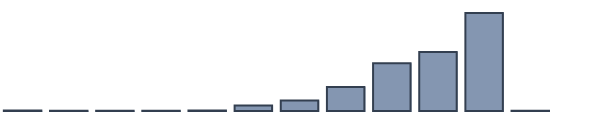
| Category | Series 0 |
|---|---|
| 0 | 0.2 |
| 1 | 0.1 |
| 2 | 0.1 |
| 3 | 0.1 |
| 4 | 0.2 |
| 5 | 2.2 |
| 6 | 4.3 |
| 7 | 9.7 |
| 8 | 19.4 |
| 9 | 23.9 |
| 10 | 39.7 |
| 11 | 0.1 |
| 12 | 0 |